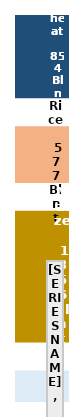
| Category | Wheat      854 Bln t | Blank 1 | Rice      577 Bln t | Blank 2 | Maize      1356 Bln t | Blank 3 | Other 326Bln t |
|---|---|---|---|---|---|---|---|
| Value | 853.707 | 300 | 576.931 | 300 | 1356.374 | 300 | 326.149 |